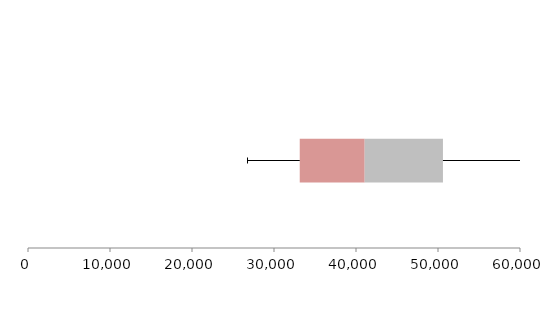
| Category | Series 1 | Series 2 | Series 3 |
|---|---|---|---|
| 0 | 33139.732 | 7920.524 | 9543.613 |